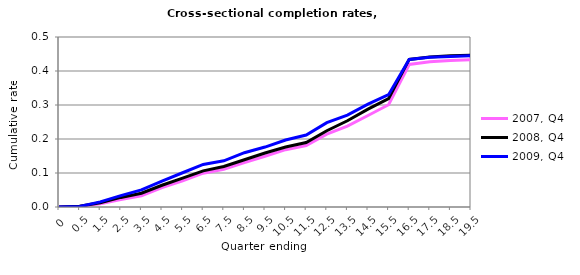
| Category | 2007, Q4 | 2008, Q4 | 2009, Q4 |
|---|---|---|---|
| 0.0 | 0 | 0 | 0 |
| 0.5 | 0.001 | 0.002 | 0.002 |
| 1.5 | 0.009 | 0.013 | 0.015 |
| 2.5 | 0.022 | 0.028 | 0.034 |
| 3.5 | 0.033 | 0.041 | 0.05 |
| 4.5 | 0.057 | 0.064 | 0.076 |
| 5.5 | 0.077 | 0.085 | 0.101 |
| 6.5 | 0.1 | 0.106 | 0.125 |
| 7.5 | 0.111 | 0.119 | 0.136 |
| 8.5 | 0.131 | 0.139 | 0.16 |
| 9.5 | 0.149 | 0.159 | 0.176 |
| 10.5 | 0.169 | 0.176 | 0.197 |
| 11.5 | 0.181 | 0.19 | 0.212 |
| 12.5 | 0.215 | 0.224 | 0.248 |
| 13.5 | 0.238 | 0.254 | 0.27 |
| 14.5 | 0.269 | 0.288 | 0.303 |
| 15.5 | 0.301 | 0.319 | 0.33 |
| 16.5 | 0.419 | 0.434 | 0.434 |
| 17.5 | 0.427 | 0.441 | 0.44 |
| 18.5 | 0.431 | 0.445 | 0.443 |
| 19.5 | 0.433 | 0.447 | 0.445 |